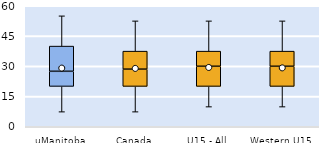
| Category | 25th | 50th | 75th |
|---|---|---|---|
| uManitoba | 20 | 7.5 | 12.5 |
| Canada | 20 | 8.571 | 8.929 |
| U15 - All | 20 | 10 | 7.5 |
| Western U15 | 20 | 10 | 7.5 |